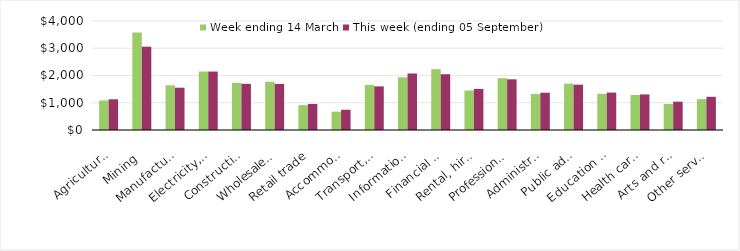
| Category | Week ending 14 March | This week (ending 05 September) |
|---|---|---|
| Agriculture, forestry and fishing | 1083.62 | 1127.38 |
| Mining | 3575.24 | 3057.77 |
| Manufacturing | 1638.41 | 1552.77 |
| Electricity, gas, water and waste services | 2144.14 | 2144.04 |
| Construction | 1729.3 | 1693.69 |
| Wholesale trade | 1769.33 | 1689.74 |
| Retail trade | 914.03 | 956.51 |
| Accommodation and food services | 673.78 | 743.48 |
| Transport, postal and warehousing | 1652.57 | 1600.44 |
| Information media and telecommunications | 1933.23 | 2074.23 |
| Financial and insurance services | 2232.45 | 2047.42 |
| Rental, hiring and real estate services | 1449.91 | 1507.54 |
| Professional, scientific and technical services | 1900.67 | 1859.99 |
| Administrative and support services | 1319.98 | 1368.13 |
| Public administration and safety | 1701.71 | 1662.49 |
| Education and training | 1327.57 | 1373.8 |
| Health care and social assistance | 1283.42 | 1305.31 |
| Arts and recreation services | 955.97 | 1039.15 |
| Other services | 1133.05 | 1218.45 |